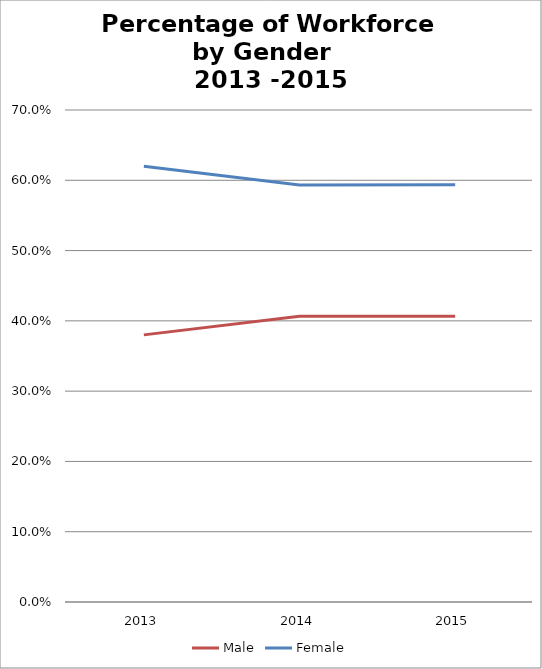
| Category | Male | Female |
|---|---|---|
| 2013.0 | 0.38 | 0.62 |
| 2014.0 | 0.407 | 0.593 |
| 2015.0 | 0.406 | 0.594 |